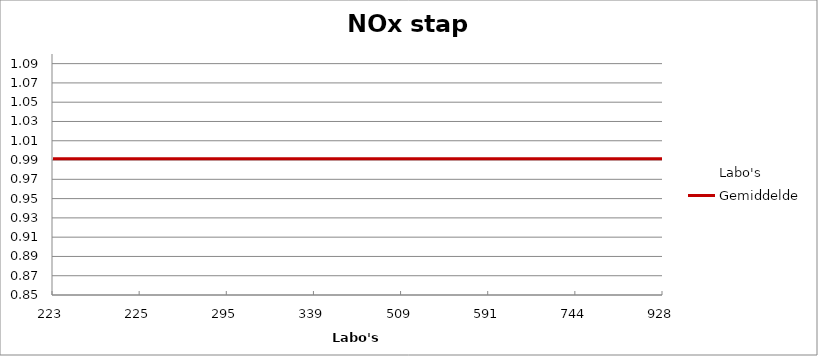
| Category | Labo's | Gemiddelde |
|---|---|---|
| 223.0 | 0.968 | 0.991 |
| 225.0 | 0.988 | 0.991 |
| 295.0 | 0.854 | 0.991 |
| 339.0 | 1.051 | 0.991 |
| 509.0 | 1.055 | 0.991 |
| 591.0 | 0.99 | 0.991 |
| 744.0 | 0.966 | 0.991 |
| 928.0 | 1.001 | 0.991 |